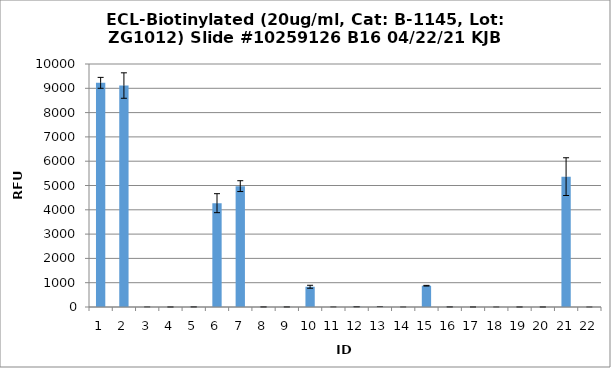
| Category | Series 0 |
|---|---|
| 0 | 9224.75 |
| 1 | 9113.25 |
| 2 | 1.5 |
| 3 | 1.25 |
| 4 | 5 |
| 5 | 4272.75 |
| 6 | 4974.25 |
| 7 | 3.5 |
| 8 | 3.25 |
| 9 | 833 |
| 10 | 1.75 |
| 11 | 10.75 |
| 12 | 5.75 |
| 13 | 0.75 |
| 14 | 876 |
| 15 | 4.5 |
| 16 | 1 |
| 17 | 0.25 |
| 18 | 1.25 |
| 19 | 1 |
| 20 | 5365 |
| 21 | 0.25 |